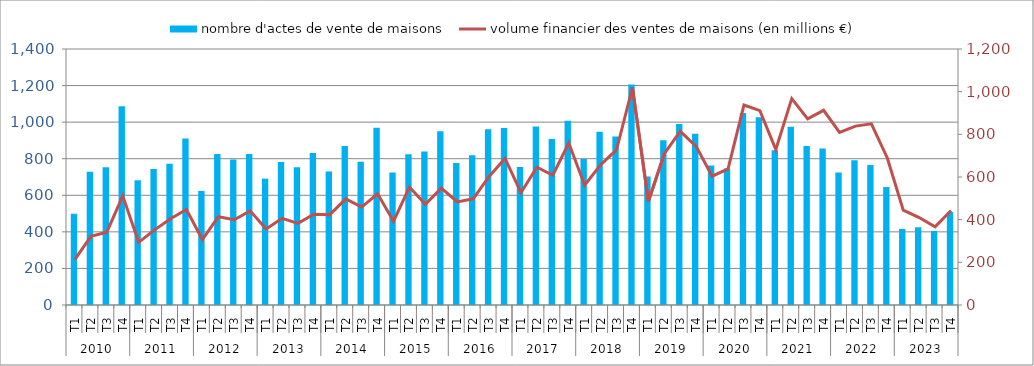
| Category | nombre d'actes de vente de maisons |
|---|---|
| 0 | 499 |
| 1 | 729 |
| 2 | 754 |
| 3 | 1087 |
| 4 | 682 |
| 5 | 744 |
| 6 | 772 |
| 7 | 910 |
| 8 | 624 |
| 9 | 826 |
| 10 | 796 |
| 11 | 826 |
| 12 | 691 |
| 13 | 782 |
| 14 | 753 |
| 15 | 831 |
| 16 | 730 |
| 17 | 870 |
| 18 | 784 |
| 19 | 969 |
| 20 | 725 |
| 21 | 825 |
| 22 | 840 |
| 23 | 950 |
| 24 | 776 |
| 25 | 819 |
| 26 | 961 |
| 27 | 968 |
| 28 | 755 |
| 29 | 976 |
| 30 | 908 |
| 31 | 1007 |
| 32 | 798 |
| 33 | 948 |
| 34 | 921 |
| 35 | 1206 |
| 36 | 703 |
| 37 | 901 |
| 38 | 990 |
| 39 | 936 |
| 40 | 763 |
| 41 | 746 |
| 42 | 1050 |
| 43 | 1027 |
| 44 | 846 |
| 45 | 975 |
| 46 | 870 |
| 47 | 856 |
| 48 | 725 |
| 49 | 792 |
| 50 | 766 |
| 51 | 645 |
| 52 | 416 |
| 53 | 425 |
| 54 | 405 |
| 55 | 508 |